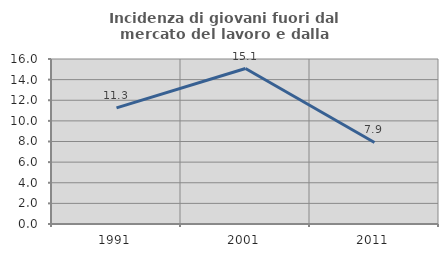
| Category | Incidenza di giovani fuori dal mercato del lavoro e dalla formazione  |
|---|---|
| 1991.0 | 11.262 |
| 2001.0 | 15.078 |
| 2011.0 | 7.91 |